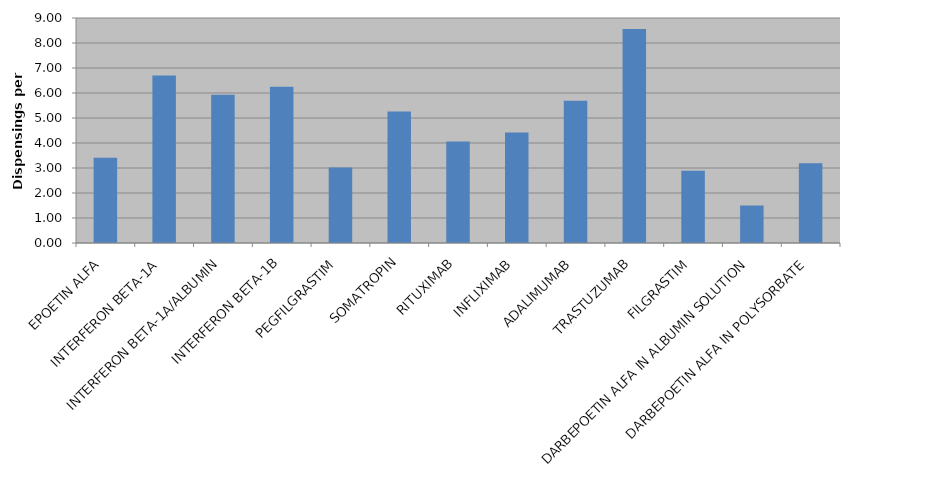
| Category | Total |
|---|---|
| EPOETIN ALFA | 3.411 |
| INTERFERON BETA-1A | 6.697 |
| INTERFERON BETA-1A/ALBUMIN | 5.929 |
| INTERFERON BETA-1B | 6.251 |
| PEGFILGRASTIM | 3.021 |
| SOMATROPIN | 5.26 |
| RITUXIMAB | 4.059 |
| INFLIXIMAB | 4.417 |
| ADALIMUMAB | 5.693 |
| TRASTUZUMAB | 8.565 |
| FILGRASTIM | 2.885 |
| DARBEPOETIN ALFA IN ALBUMIN SOLUTION | 1.5 |
| DARBEPOETIN ALFA IN POLYSORBATE | 3.189 |